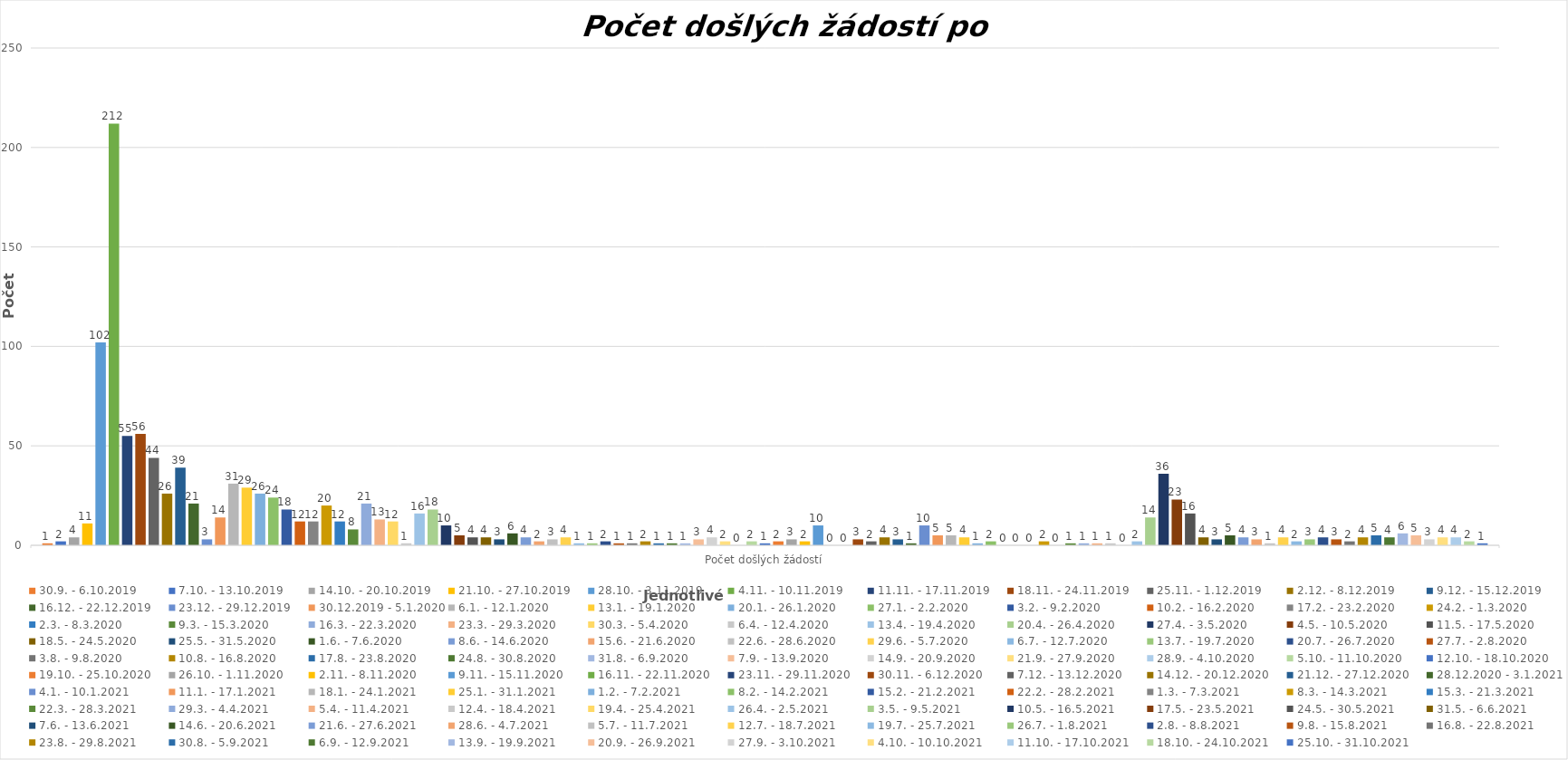
| Category | 30.9. - 6.10.2019 | 7.10. - 13.10.2019 | 14.10. - 20.10.2019 | 21.10. - 27.10.2019 | 28.10. - 3.11.2019 | 4.11. - 10.11.2019 | 11.11. - 17.11.2019 | 18.11. - 24.11.2019 | 25.11. - 1.12.2019 | 2.12. - 8.12.2019 | 9.12. - 15.12.2019 | 16.12. - 22.12.2019 | 23.12. - 29.12.2019 | 30.12.2019 - 5.1.2020 | 6.1. - 12.1.2020 | 13.1. - 19.1.2020 | 20.1. - 26.1.2020 | 27.1. - 2.2.2020 | 3.2. - 9.2.2020 | 10.2. - 16.2.2020 | 17.2. - 23.2.2020 | 24.2. - 1.3.2020 | 2.3. - 8.3.2020 | 9.3. - 15.3.2020 | 16.3. - 22.3.2020 | 23.3. - 29.3.2020 | 30.3. - 5.4.2020 | 6.4. - 12.4.2020 | 13.4. - 19.4.2020 | 20.4. - 26.4.2020 | 27.4. - 3.5.2020 | 4.5. - 10.5.2020 | 11.5. - 17.5.2020 | 18.5. - 24.5.2020 | 25.5. - 31.5.2020 | 1.6. - 7.6.2020 | 8.6. - 14.6.2020 | 15.6. - 21.6.2020 | 22.6. - 28.6.2020 | 29.6. - 5.7.2020 | 6.7. - 12.7.2020 | 13.7. - 19.7.2020 | 20.7. - 26.7.2020 | 27.7. - 2.8.2020 | 3.8. - 9.8.2020 | 10.8. - 16.8.2020 | 17.8. - 23.8.2020 | 24.8. - 30.8.2020 | 31.8. - 6.9.2020 | 7.9. - 13.9.2020 | 14.9. - 20.9.2020 | 21.9. - 27.9.2020 | 28.9. - 4.10.2020 | 5.10. - 11.10.2020 | 12.10. - 18.10.2020 | 19.10. - 25.10.2020 | 26.10. - 1.11.2020 | 2.11. - 8.11.2020 | 9.11. - 15.11.2020 | 16.11. - 22.11.2020 | 23.11. - 29.11.2020 | 30.11. - 6.12.2020 | 7.12. - 13.12.2020 | 14.12. - 20.12.2020 | 21.12. - 27.12.2020 | 28.12.2020 - 3.1.2021 | 4.1. - 10.1.2021 | 11.1. - 17.1.2021 | 18.1. - 24.1.2021 | 25.1. - 31.1.2021 | 1.2. - 7.2.2021 | 8.2. - 14.2.2021 | 15.2. - 21.2.2021 | 22.2. - 28.2.2021 | 1.3. - 7.3.2021 | 8.3. - 14.3.2021 | 15.3. - 21.3.2021 | 22.3. - 28.3.2021 | 29.3. - 4.4.2021 | 5.4. - 11.4.2021 | 12.4. - 18.4.2021 | 19.4. - 25.4.2021 | 26.4. - 2.5.2021 | 3.5. - 9.5.2021 | 10.5. - 16.5.2021 | 17.5. - 23.5.2021 | 24.5. - 30.5.2021 | 31.5. - 6.6.2021 | 7.6. - 13.6.2021 | 14.6. - 20.6.2021 | 21.6. - 27.6.2021 | 28.6. - 4.7.2021 | 5.7. - 11.7.2021 | 12.7. - 18.7.2021 | 19.7. - 25.7.2021 | 26.7. - 1.8.2021 | 2.8. - 8.8.2021 | 9.8. - 15.8.2021 | 16.8. - 22.8.2021 | 23.8. - 29.8.2021 | 30.8. - 5.9.2021 | 6.9. - 12.9.2021 | 13.9. - 19.9.2021 | 20.9. - 26.9.2021 | 27.9. - 3.10.2021 | 4.10. - 10.10.2021 | 11.10. - 17.10.2021 | 18.10. - 24.10.2021 | 25.10. - 31.10.2021 |
|---|---|---|---|---|---|---|---|---|---|---|---|---|---|---|---|---|---|---|---|---|---|---|---|---|---|---|---|---|---|---|---|---|---|---|---|---|---|---|---|---|---|---|---|---|---|---|---|---|---|---|---|---|---|---|---|---|---|---|---|---|---|---|---|---|---|---|---|---|---|---|---|---|---|---|---|---|---|---|---|---|---|---|---|---|---|---|---|---|---|---|---|---|---|---|---|---|---|---|---|---|---|---|---|---|---|---|---|---|---|
| Počet došlých žádostí | 1 | 2 | 4 | 11 | 102 | 212 | 55 | 56 | 44 | 26 | 39 | 21 | 3 | 14 | 31 | 29 | 26 | 24 | 18 | 12 | 12 | 20 | 12 | 8 | 21 | 13 | 12 | 1 | 16 | 18 | 10 | 5 | 4 | 4 | 3 | 6 | 4 | 2 | 3 | 4 | 1 | 1 | 2 | 1 | 1 | 2 | 1 | 1 | 1 | 3 | 4 | 2 | 0 | 2 | 1 | 2 | 3 | 2 | 10 | 0 | 0 | 3 | 2 | 4 | 3 | 1 | 10 | 5 | 5 | 4 | 1 | 2 | 0 | 0 | 0 | 2 | 0 | 1 | 1 | 1 | 1 | 0 | 2 | 14 | 36 | 23 | 16 | 4 | 3 | 5 | 4 | 3 | 1 | 4 | 2 | 3 | 4 | 3 | 2 | 4 | 5 | 4 | 6 | 5 | 3 | 4 | 4 | 2 | 1 |